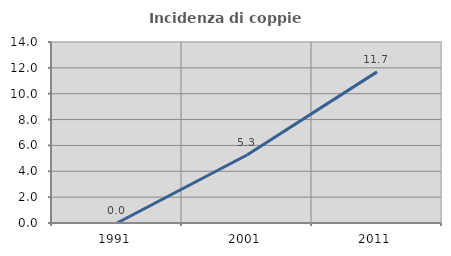
| Category | Incidenza di coppie miste |
|---|---|
| 1991.0 | 0 |
| 2001.0 | 5.263 |
| 2011.0 | 11.688 |